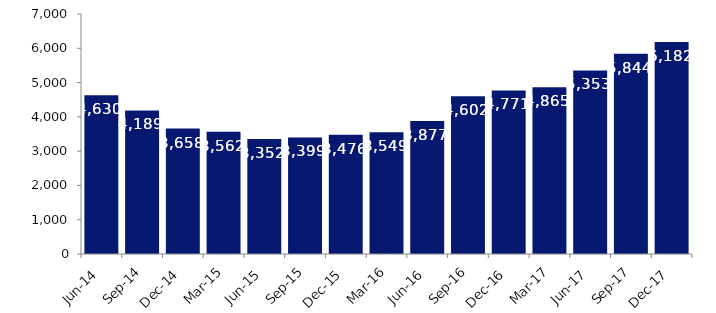
| Category | Series 0 |
|---|---|
| Jun-14 | 4630 |
| Sep-14 | 4189 |
| Dec-14 | 3658 |
| Mar-15 | 3562 |
| Jun-15 | 3352 |
| Sep-15 | 3399 |
| Dec-15 | 3476 |
| Mar-16 | 3549 |
| Jun-16 | 3877 |
| Sep-16 | 4602 |
| Dec-16 | 4771 |
| Mar-17 | 4865 |
| Jun-17 | 5353 |
| Sep-17 | 5844 |
| Dec-17 | 6182 |